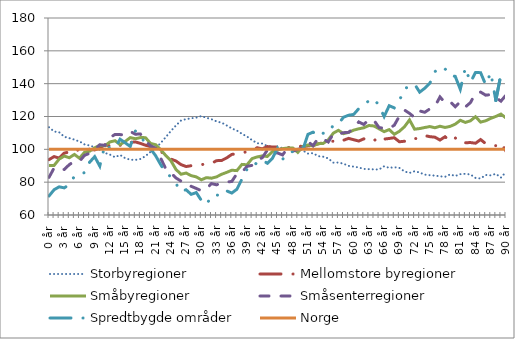
| Category | Storbyregioner | Mellomstore byregioner | Småbyregioner | Småsenterregioner | Spredtbygde områder | Norge |
|---|---|---|---|---|---|---|
| 0 år | 113.45 | 93.729 | 90.179 | 82.923 | 71.587 | 100 |
| 1 år | 110.854 | 95.581 | 90.2 | 88.64 | 75.386 | 100 |
| 2 år | 110.393 | 94.67 | 94.045 | 87.449 | 77.164 | 100 |
| 3 år | 107.674 | 97.702 | 95.894 | 87.752 | 76.53 | 100 |
| 4 år | 106.829 | 98.384 | 94.883 | 90.679 | 78.507 | 100 |
| 5 år | 105.91 | 97.836 | 96.892 | 92.774 | 83.597 | 100 |
| 6 år | 104.809 | 100.394 | 94.587 | 92.693 | 84.926 | 100 |
| 7 år | 102.987 | 100.328 | 98.203 | 96.352 | 85.801 | 100 |
| 8 år | 102.352 | 100.001 | 98.836 | 97.591 | 92.162 | 100 |
| 9 år | 101.276 | 99.636 | 100.898 | 99.934 | 95.553 | 100 |
| 10 år | 99.695 | 100.86 | 102.424 | 102.779 | 89.798 | 100 |
| 11 år | 97.836 | 102.708 | 102.125 | 102.385 | 102.615 | 100 |
| 12 år | 96.784 | 102.177 | 104.493 | 107.201 | 100.947 | 100 |
| 13 år | 95.206 | 103.373 | 105.243 | 109.061 | 100.787 | 100 |
| 14 år | 96.55 | 102.427 | 102.924 | 108.968 | 106.164 | 100 |
| 15 år | 94.634 | 104.307 | 104.781 | 108.797 | 104.008 | 100 |
| 16 år | 93.664 | 104.227 | 107.143 | 110.896 | 101.718 | 100 |
| 17 år | 93.553 | 104.528 | 106.461 | 109.238 | 111.129 | 100 |
| 18 år | 94.119 | 103.628 | 107.141 | 109.301 | 108.843 | 100 |
| 19 år | 95.832 | 102.493 | 107.129 | 104.983 | 102.914 | 100 |
| 20 år | 98.494 | 101.662 | 103.591 | 102.177 | 100.289 | 100 |
| 21 år | 100.842 | 99.335 | 102.831 | 100.641 | 96.117 | 100 |
| 22 år | 103.823 | 98.49 | 99.752 | 94.607 | 90.662 | 100 |
| 23 år | 107.445 | 97.039 | 96.214 | 88.09 | 85.734 | 100 |
| 24 år | 111.109 | 94.087 | 93.098 | 85.74 | 83.299 | 100 |
| 25 år | 114.51 | 92.9 | 87.77 | 82.569 | 79.128 | 100 |
| 26 år | 117.559 | 90.694 | 84.831 | 80.644 | 74.282 | 100 |
| 27 år | 118.422 | 89.52 | 85.563 | 78.285 | 75.359 | 100 |
| 28 år | 118.918 | 90.014 | 83.983 | 77.483 | 72.58 | 100 |
| 29 år | 119.299 | 90.036 | 83.218 | 76.177 | 73.667 | 100 |
| 30 år | 120.247 | 90.634 | 81.445 | 74.775 | 68.946 | 100 |
| 31 år | 119.207 | 91.247 | 82.756 | 75.997 | 66.32 | 100 |
| 32 år | 118.355 | 91.438 | 82.416 | 79.117 | 71.545 | 100 |
| 33 år | 117.037 | 93.097 | 83.228 | 78.38 | 72.188 | 100 |
| 34 år | 116.221 | 93.233 | 84.813 | 79.659 | 71.698 | 100 |
| 35 år | 114.535 | 94.794 | 85.97 | 80.05 | 74.677 | 100 |
| 36 år | 112.695 | 96.9 | 87.275 | 80.428 | 73.366 | 100 |
| 37 år | 111.467 | 97.332 | 87.034 | 85.161 | 75.685 | 100 |
| 38 år | 109.449 | 97.701 | 90.826 | 85.947 | 81.857 | 100 |
| 39 år | 107.782 | 98.687 | 90.593 | 89.646 | 87.933 | 100 |
| 40 år | 105.585 | 99.787 | 94.383 | 90.255 | 88.241 | 100 |
| 41 år | 103.694 | 100.957 | 95.366 | 93.205 | 92.344 | 100 |
| 42 år | 103.517 | 100.308 | 95.999 | 94.93 | 93.505 | 100 |
| 43 år | 102.002 | 101.673 | 95.644 | 99.556 | 91.493 | 100 |
| 44 år | 101.363 | 101.447 | 98.642 | 97.561 | 94.514 | 100 |
| 45 år | 100.684 | 101.366 | 99.67 | 97.812 | 100.67 | 100 |
| 46 år | 101.024 | 101.275 | 100.431 | 96.579 | 93.883 | 100 |
| 47 år | 100.078 | 101.066 | 100.794 | 100.762 | 97.521 | 100 |
| 48 år | 100.131 | 101.338 | 100.846 | 98.835 | 98.708 | 100 |
| 49 år | 100.332 | 102.193 | 98.145 | 99.883 | 99.441 | 100 |
| 50 år | 99.308 | 101.565 | 101.74 | 101.166 | 99.865 | 100 |
| 51 år | 97.407 | 102.113 | 102.645 | 104.742 | 109.123 | 100 |
| 52 år | 97.68 | 102.47 | 102.163 | 102.148 | 110.474 | 100 |
| 53 år | 95.839 | 103.313 | 103.446 | 106.818 | 107.902 | 100 |
| 54 år | 95.496 | 104.014 | 103.594 | 106.218 | 109.798 | 100 |
| 55 år | 94.481 | 104.885 | 105.808 | 104.455 | 110.274 | 100 |
| 56 år | 91.88 | 104.916 | 109.876 | 109.438 | 114.651 | 100 |
| 57 år | 91.985 | 104.015 | 111.57 | 109.258 | 115.625 | 100 |
| 58 år | 91.253 | 105.543 | 109.57 | 110.138 | 119.553 | 100 |
| 59 år | 89.919 | 106.675 | 110.328 | 110.352 | 120.778 | 100 |
| 60 år | 89.467 | 105.85 | 111.691 | 112.822 | 121.264 | 100 |
| 61 år | 88.951 | 105.057 | 112.513 | 116.665 | 124.771 | 100 |
| 62 år | 88.061 | 106.399 | 113.14 | 115.116 | 127.426 | 100 |
| 63 år | 87.929 | 104.762 | 114.522 | 118.179 | 129.503 | 100 |
| 64 år | 87.785 | 105.197 | 114.225 | 117.678 | 130.841 | 100 |
| 65 år | 87.705 | 107.777 | 112.5 | 113.216 | 126.572 | 100 |
| 66 år | 89.689 | 106.239 | 110.788 | 112.869 | 120.009 | 100 |
| 67 år | 88.721 | 106.616 | 112.02 | 112.773 | 126.575 | 100 |
| 68 år | 89.087 | 107.086 | 109.164 | 114.693 | 125.246 | 100 |
| 69 år | 88.739 | 104.616 | 110.988 | 120.219 | 129.688 | 100 |
| 70 år | 86.537 | 104.915 | 113.744 | 123.931 | 136.824 | 100 |
| 71 år | 85.64 | 104.742 | 117.925 | 121.893 | 138.569 | 100 |
| 72 år | 86.677 | 106.571 | 112.257 | 119.387 | 139.682 | 100 |
| 73 år | 85.851 | 106.588 | 112.655 | 123.367 | 134.829 | 100 |
| 74 år | 84.6 | 108.385 | 113.291 | 122.563 | 137.228 | 100 |
| 75 år | 84.257 | 107.715 | 113.881 | 124.642 | 140.242 | 100 |
| 76 år | 83.986 | 107.4 | 113.146 | 126.194 | 147.298 | 100 |
| 77 år | 83.58 | 105.662 | 114.063 | 131.926 | 150.035 | 100 |
| 78 år | 83.262 | 107.67 | 113.324 | 128.286 | 149.026 | 100 |
| 79 år | 84.741 | 105.004 | 113.975 | 129.076 | 145.107 | 100 |
| 80 år | 83.75 | 106.982 | 115.337 | 125.914 | 144.442 | 100 |
| 81 år | 84.89 | 104.042 | 117.685 | 129.056 | 136.572 | 100 |
| 82 år | 85.084 | 104.018 | 116.385 | 125.804 | 149.651 | 100 |
| 83 år | 84.683 | 104.129 | 117.387 | 128.476 | 140.813 | 100 |
| 84 år | 82.557 | 103.719 | 119.875 | 134.152 | 146.841 | 100 |
| 85 år | 82.246 | 105.945 | 116.594 | 134.88 | 146.692 | 100 |
| 86 år | 84.379 | 103.461 | 117.397 | 132.984 | 139.352 | 100 |
| 87 år | 84.137 | 102.357 | 118.859 | 133.355 | 146.75 | 100 |
| 88 år | 85.058 | 102.239 | 120.04 | 131.594 | 129.749 | 100 |
| 89 år | 82.806 | 104.058 | 121.462 | 129.347 | 145.686 | 100 |
| 90 år | 86.254 | 98.856 | 119.093 | 133.023 | 147.294 | 100 |